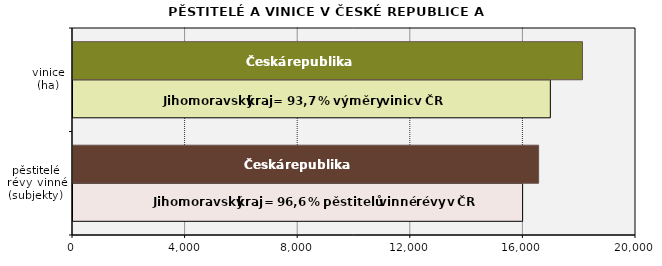
| Category | JHM | ČR |
|---|---|---|
| pěstitelé
révy vinné
(subjekty) | 15972 | 16541 |
| vinice
(ha) | 16957.324 | 18099.365 |